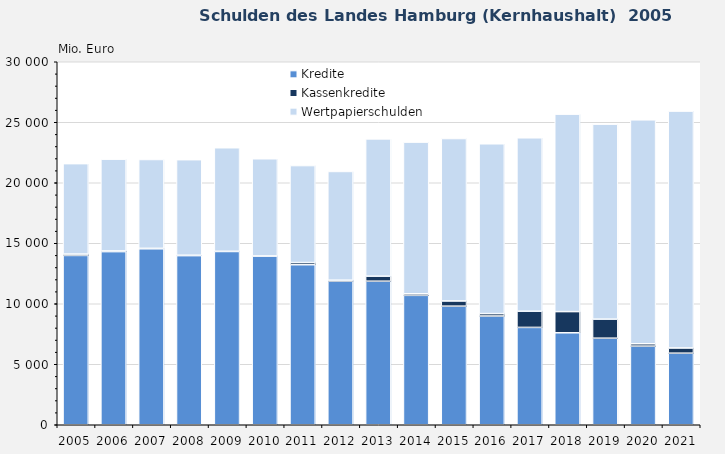
| Category | Kredite | Kassenkredite | Wertpapierschulden |
|---|---|---|---|
| 2005.0 | 13993 | 115 | 7472 |
| 2006.0 | 14309 | 58 | 7582 |
| 2007.0 | 14546 | 33 | 7343 |
| 2008.0 | 13976 | 33 | 7898 |
| 2009.0 | 14321 | 14 | 8558 |
| 2010.0 | 13949 | 2 | 8032 |
| 2011.0 | 13227 | 179 | 8015 |
| 2012.0 | 11873 | 75 | 8985 |
| 2013.0 | 11865 | 414 | 11347 |
| 2014.0 | 10695 | 131 | 12532 |
| 2015.0 | 9802 | 430 | 13423 |
| 2016.0 | 8987 | 199 | 14035 |
| 2017.0 | 8046 | 1335 | 14335 |
| 2018.0 | 7601 | 1751 | 16319 |
| 2019.0 | 7155 | 1574 | 16114 |
| 2020.0 | 6499 | 195 | 18507 |
| 2021.0 | 5916 | 430 | 19575 |